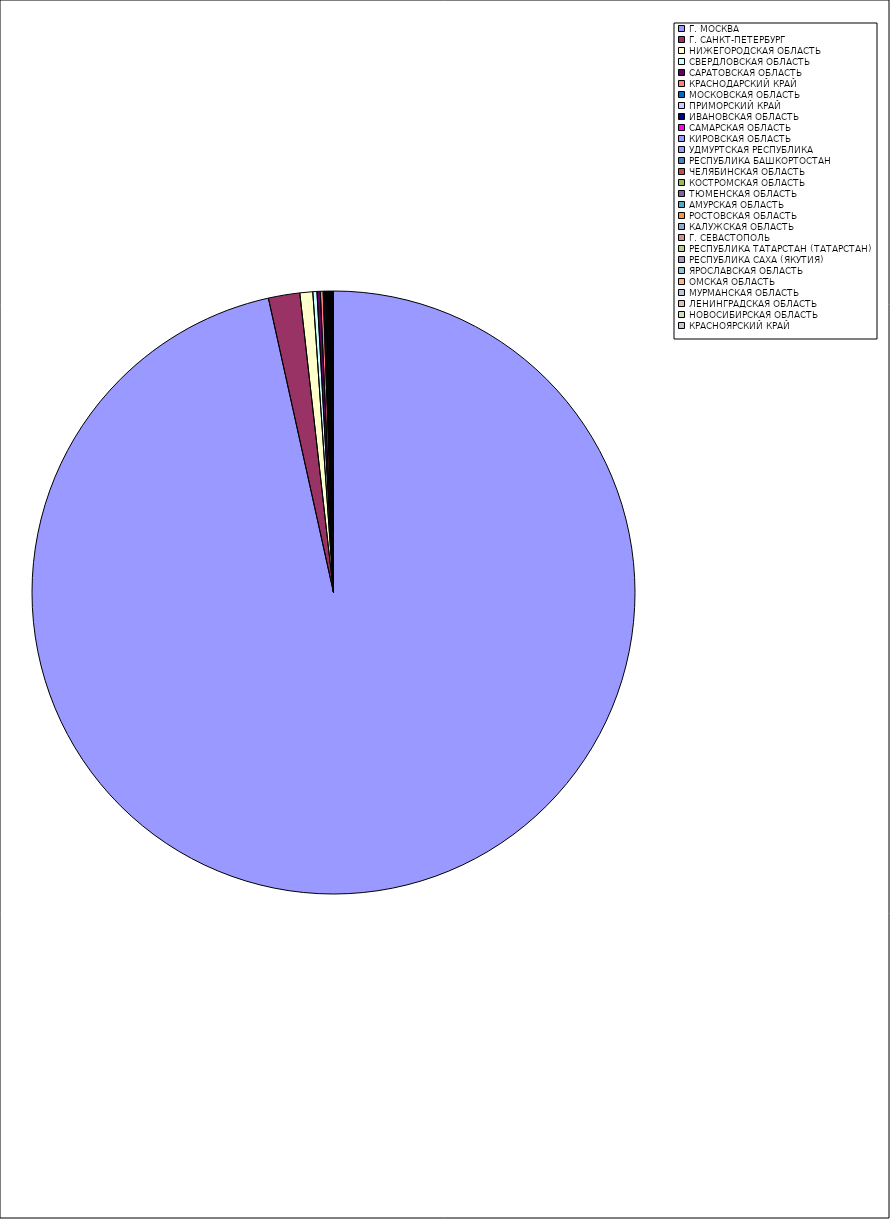
| Category | Оборот |
|---|---|
| Г. МОСКВА | 96.49 |
| Г. САНКТ-ПЕТЕРБУРГ | 1.679 |
| НИЖЕГОРОДСКАЯ ОБЛАСТЬ | 0.689 |
| СВЕРДЛОВСКАЯ ОБЛАСТЬ | 0.221 |
| САРАТОВСКАЯ ОБЛАСТЬ | 0.178 |
| КРАСНОДАРСКИЙ КРАЙ | 0.151 |
| МОСКОВСКАЯ ОБЛАСТЬ | 0.064 |
| ПРИМОРСКИЙ КРАЙ | 0.056 |
| ИВАНОВСКАЯ ОБЛАСТЬ | 0.056 |
| САМАРСКАЯ ОБЛАСТЬ | 0.048 |
| КИРОВСКАЯ ОБЛАСТЬ | 0.047 |
| УДМУРТСКАЯ РЕСПУБЛИКА | 0.038 |
| РЕСПУБЛИКА БАШКОРТОСТАН | 0.035 |
| ЧЕЛЯБИНСКАЯ ОБЛАСТЬ | 0.031 |
| КОСТРОМСКАЯ ОБЛАСТЬ | 0.028 |
| ТЮМЕНСКАЯ ОБЛАСТЬ | 0.023 |
| АМУРСКАЯ ОБЛАСТЬ | 0.022 |
| РОСТОВСКАЯ ОБЛАСТЬ | 0.017 |
| КАЛУЖСКАЯ ОБЛАСТЬ | 0.011 |
| Г. СЕВАСТОПОЛЬ | 0.011 |
| РЕСПУБЛИКА ТАТАРСТАН (ТАТАРСТАН) | 0.01 |
| РЕСПУБЛИКА САХА (ЯКУТИЯ) | 0.008 |
| ЯРОСЛАВСКАЯ ОБЛАСТЬ | 0.008 |
| ОМСКАЯ ОБЛАСТЬ | 0.008 |
| МУРМАНСКАЯ ОБЛАСТЬ | 0.007 |
| ЛЕНИНГРАДСКАЯ ОБЛАСТЬ | 0.007 |
| НОВОСИБИРСКАЯ ОБЛАСТЬ | 0.006 |
| КРАСНОЯРСКИЙ КРАЙ | 0.006 |